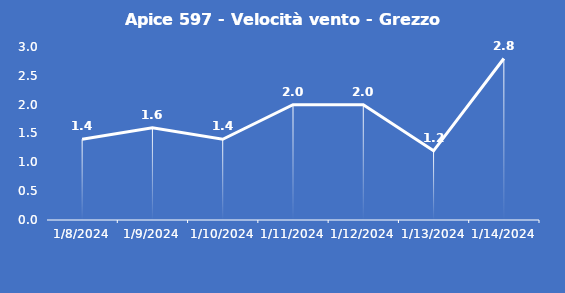
| Category | Apice 597 - Velocità vento - Grezzo (m/s) |
|---|---|
| 1/8/24 | 1.4 |
| 1/9/24 | 1.6 |
| 1/10/24 | 1.4 |
| 1/11/24 | 2 |
| 1/12/24 | 2 |
| 1/13/24 | 1.2 |
| 1/14/24 | 2.8 |